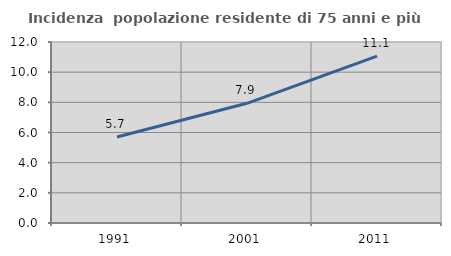
| Category | Incidenza  popolazione residente di 75 anni e più |
|---|---|
| 1991.0 | 5.701 |
| 2001.0 | 7.935 |
| 2011.0 | 11.06 |